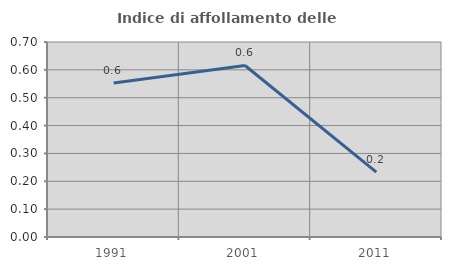
| Category | Indice di affollamento delle abitazioni  |
|---|---|
| 1991.0 | 0.552 |
| 2001.0 | 0.616 |
| 2011.0 | 0.233 |